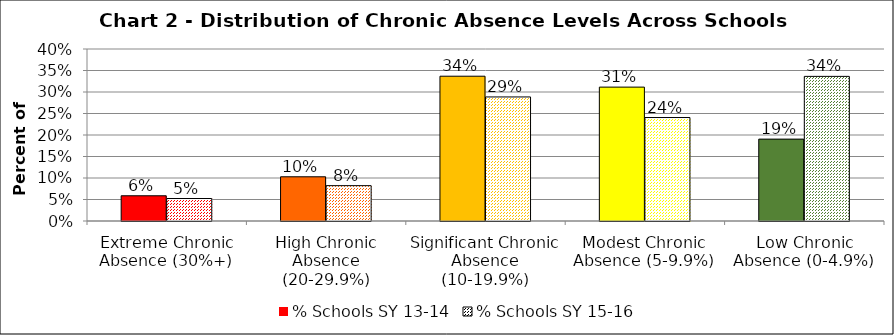
| Category | % Schools SY 13-14 | % Schools SY 15-16 |
|---|---|---|
| Extreme Chronic Absence (30%+) | 0.059 | 0.052 |
| High Chronic Absence (20-29.9%) | 0.103 | 0.082 |
| Significant Chronic Absence (10-19.9%) | 0.337 | 0.288 |
| Modest Chronic Absence (5-9.9%) | 0.311 | 0.241 |
| Low Chronic Absence (0-4.9%) | 0.19 | 0.336 |